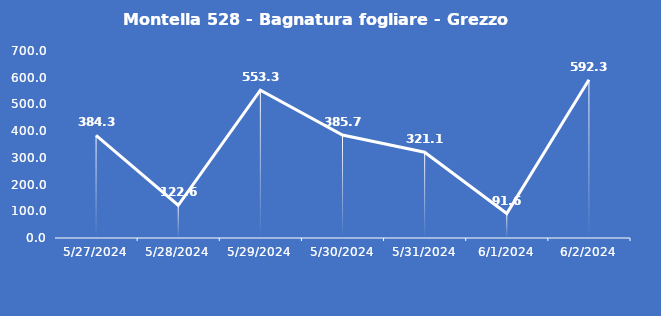
| Category | Montella 528 - Bagnatura fogliare - Grezzo (min) |
|---|---|
| 5/27/24 | 384.3 |
| 5/28/24 | 122.6 |
| 5/29/24 | 553.3 |
| 5/30/24 | 385.7 |
| 5/31/24 | 321.1 |
| 6/1/24 | 91.6 |
| 6/2/24 | 592.3 |